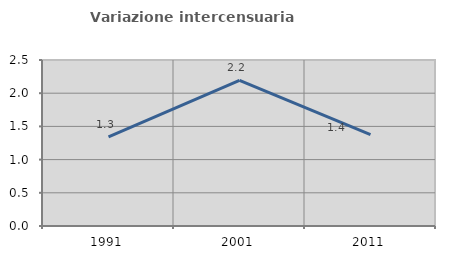
| Category | Variazione intercensuaria annua |
|---|---|
| 1991.0 | 1.341 |
| 2001.0 | 2.195 |
| 2011.0 | 1.376 |